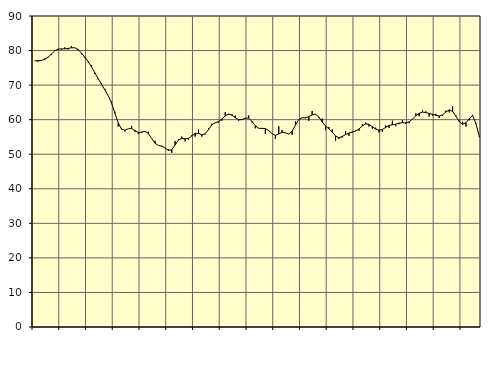
| Category | Piggar | Series 1 |
|---|---|---|
| nan | 77 | 77.01 |
| 87.0 | 76.8 | 77.05 |
| 87.0 | 77.1 | 77.18 |
| 87.0 | 77.7 | 77.41 |
| nan | 78.2 | 78.04 |
| 88.0 | 78.7 | 78.99 |
| 88.0 | 80.1 | 79.9 |
| 88.0 | 80.2 | 80.42 |
| nan | 80.3 | 80.49 |
| 89.0 | 80.9 | 80.5 |
| 89.0 | 80.3 | 80.61 |
| 89.0 | 81.3 | 80.8 |
| nan | 80.9 | 80.8 |
| 90.0 | 80.5 | 80.25 |
| 90.0 | 78.9 | 79.25 |
| 90.0 | 77.9 | 78.09 |
| nan | 76.6 | 76.79 |
| 91.0 | 75.8 | 75.27 |
| 91.0 | 73.2 | 73.56 |
| 91.0 | 71.6 | 71.87 |
| nan | 70.5 | 70.22 |
| 92.0 | 68.9 | 68.61 |
| 92.0 | 67 | 66.95 |
| 92.0 | 65.2 | 64.77 |
| nan | 62.3 | 61.89 |
| 93.0 | 58 | 59.05 |
| 93.0 | 57.5 | 57.22 |
| 93.0 | 56.6 | 56.93 |
| nan | 57.4 | 57.37 |
| 94.0 | 58.2 | 57.44 |
| 94.0 | 56.4 | 56.85 |
| 94.0 | 55.8 | 56.27 |
| nan | 56.2 | 56.4 |
| 95.0 | 56.5 | 56.61 |
| 95.0 | 56.5 | 56.01 |
| 95.0 | 54.6 | 54.56 |
| nan | 53.9 | 53.17 |
| 96.0 | 52.5 | 52.55 |
| 96.0 | 52.5 | 52.34 |
| 96.0 | 51.8 | 51.81 |
| nan | 51.4 | 51.13 |
| 97.0 | 50.4 | 51.31 |
| 97.0 | 53.8 | 52.66 |
| 97.0 | 54.4 | 54.11 |
| nan | 55.1 | 54.59 |
| 98.0 | 53.7 | 54.44 |
| 98.0 | 54.2 | 54.58 |
| 98.0 | 55.5 | 55.27 |
| nan | 55.1 | 56.06 |
| 99.0 | 57.1 | 56.03 |
| 99.0 | 55.1 | 55.64 |
| 99.0 | 55.7 | 55.92 |
| nan | 57.6 | 57.13 |
| 0.0 | 58.8 | 58.52 |
| 0.0 | 59 | 59.09 |
| 0.0 | 59.1 | 59.46 |
| nan | 59.7 | 60.18 |
| 1.0 | 62.2 | 61.11 |
| 1.0 | 61.5 | 61.64 |
| 1.0 | 61.6 | 61.3 |
| nan | 61.2 | 60.58 |
| 2.0 | 59.7 | 60.04 |
| 2.0 | 60.2 | 60 |
| 2.0 | 60.3 | 60.44 |
| nan | 61.2 | 60.44 |
| 3.0 | 59.2 | 59.51 |
| 3.0 | 57.5 | 58.22 |
| 3.0 | 57.5 | 57.49 |
| nan | 57.4 | 57.48 |
| 4.0 | 55.9 | 57.42 |
| 4.0 | 56.9 | 56.83 |
| 4.0 | 56 | 55.95 |
| nan | 54.4 | 55.49 |
| 5.0 | 58.1 | 55.84 |
| 5.0 | 57 | 56.36 |
| 5.0 | 56.2 | 56.16 |
| nan | 55.8 | 55.86 |
| 6.0 | 55.6 | 56.66 |
| 6.0 | 59.5 | 58.44 |
| 6.0 | 60 | 60.06 |
| nan | 60.6 | 60.56 |
| 7.0 | 60.4 | 60.55 |
| 7.0 | 59.7 | 60.88 |
| 7.0 | 62.5 | 61.4 |
| nan | 61.5 | 61.57 |
| 8.0 | 60.5 | 60.75 |
| 8.0 | 60.3 | 59.36 |
| 8.0 | 57 | 58.18 |
| nan | 57.9 | 57.31 |
| 9.0 | 57.2 | 56.37 |
| 9.0 | 53.9 | 55.28 |
| 9.0 | 54.4 | 54.77 |
| nan | 54.8 | 55.13 |
| 10.0 | 56.7 | 55.7 |
| 10.0 | 55.3 | 56.14 |
| 10.0 | 56.6 | 56.39 |
| nan | 56.9 | 56.72 |
| 11.0 | 56.8 | 57.3 |
| 11.0 | 58.7 | 58.18 |
| 11.0 | 59.2 | 58.8 |
| nan | 58 | 58.63 |
| 12.0 | 57.4 | 57.98 |
| 12.0 | 57.7 | 57.27 |
| 12.0 | 56.3 | 56.97 |
| nan | 56.5 | 57.14 |
| 13.0 | 58.3 | 57.76 |
| 13.0 | 57.6 | 58.34 |
| 13.0 | 59.7 | 58.51 |
| nan | 58.1 | 58.71 |
| 14.0 | 58.7 | 59 |
| 14.0 | 59.9 | 59.12 |
| 14.0 | 58.8 | 59.07 |
| nan | 59 | 59.34 |
| 15.0 | 60.2 | 60.15 |
| 15.0 | 61.8 | 61.11 |
| 15.0 | 61 | 61.84 |
| nan | 62.7 | 62.19 |
| 16.0 | 62.4 | 62.07 |
| 16.0 | 60.9 | 61.78 |
| 16.0 | 61.2 | 61.56 |
| nan | 61.7 | 61.25 |
| 17.0 | 60.5 | 61.07 |
| 17.0 | 61.1 | 61.4 |
| 17.0 | 62.6 | 62.21 |
| nan | 62.1 | 62.83 |
| 18.0 | 63.8 | 62.39 |
| 18.0 | 61.3 | 60.99 |
| 18.0 | 59.8 | 59.41 |
| nan | 59.4 | 58.65 |
| 19.0 | 58 | 59.12 |
| 19.0 | 59.8 | 60.27 |
| 19.0 | 61.4 | 61.21 |
| nan | 59 | 58.8 |
| 20.0 | 54.9 | 55.15 |